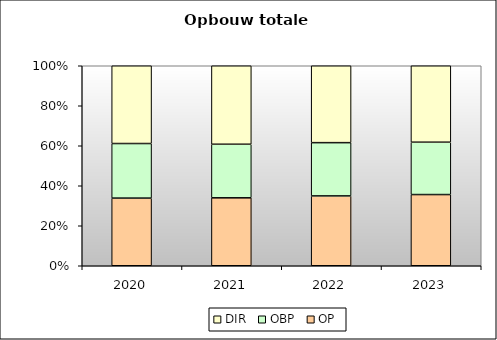
| Category | OP | OBP | DIR |
|---|---|---|---|
| 2020.0 | 74413.467 | 60021.867 | 85554.133 |
| 2021.0 | 81056.933 | 63934.4 | 93656.8 |
| 2022.0 | 88406.4 | 67419.2 | 97347.2 |
| 2023.0 | 93512 | 68780.8 | 100424 |